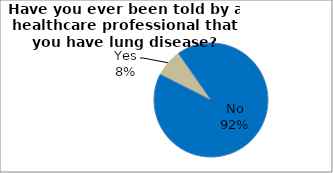
| Category | Series 0 |
|---|---|
| No | 92.151 |
| Yes | 7.849 |